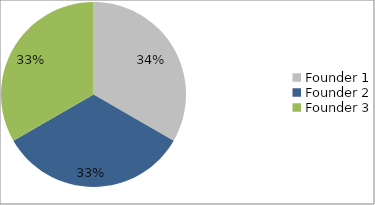
| Category | Equity % |
|---|---|
| Founder 1 | 0.333 |
| Founder 2 | 0.333 |
| Founder 3 | 0.333 |